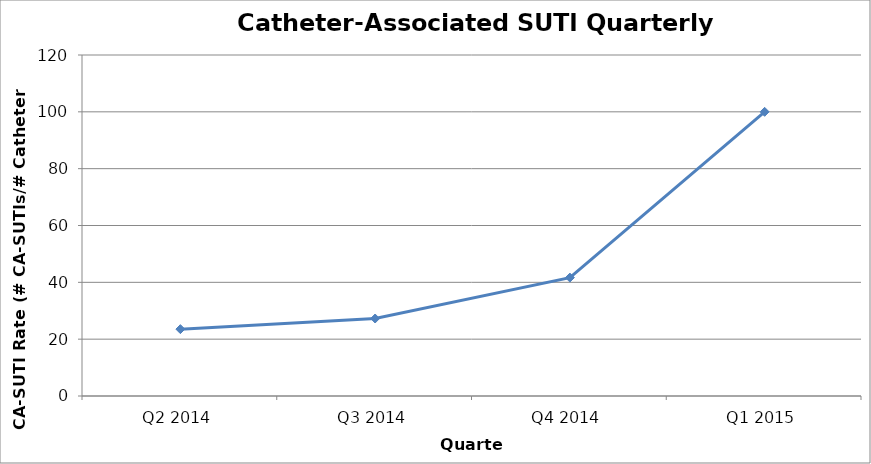
| Category | Series 0 |
|---|---|
| Q2 2014 | 23.529 |
| Q3 2014 | 27.273 |
| Q4 2014 | 41.667 |
| Q1 2015 | 100 |